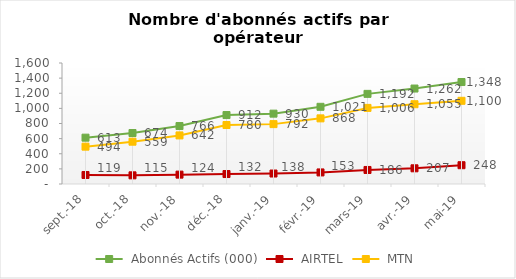
| Category | Series 5 | Series 6 | Series 7 |
|---|---|---|---|
| sept.-18 | 612.774 | 119.016 | 493.758 |
| oct.-18 | 674.073 | 114.58 | 559.493 |
| nov.-18 | 766.339 | 123.914 | 642.425 |
| déc.-18 | 911.789 | 131.647 | 780.142 |
| janv.-19 | 930.174 | 138.437 | 791.737 |
| févr.-19 | 1020.836 | 152.964 | 867.872 |
| mars-19 | 1191.865 | 185.632 | 1006.233 |
| avr.-19 | 1262.375 | 207.48 | 1054.895 |
| mai-19 | 1348.464 | 248.399 | 1100.065 |